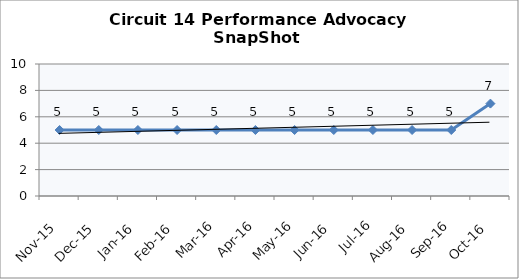
| Category | Circuit 14 |
|---|---|
| Nov-15 | 5 |
| Dec-15 | 5 |
| Jan-16 | 5 |
| Feb-16 | 5 |
| Mar-16 | 5 |
| Apr-16 | 5 |
| May-16 | 5 |
| Jun-16 | 5 |
| Jul-16 | 5 |
| Aug-16 | 5 |
| Sep-16 | 5 |
| Oct-16 | 7 |